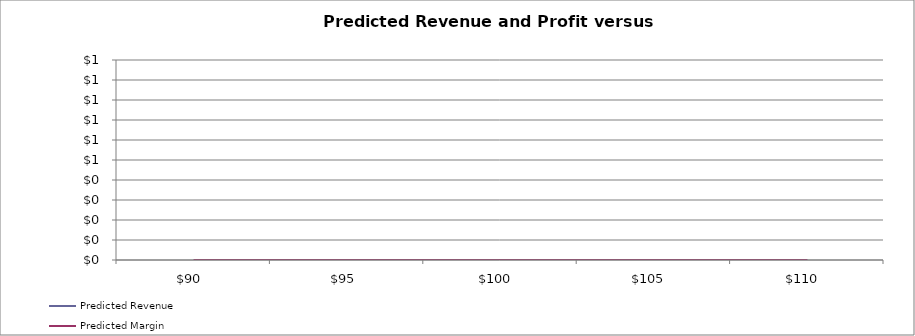
| Category | Predicted Revenue | Predicted Margin |
|---|---|---|
| 90.0 | 0 | 0 |
| 95.0 | 0 | 0 |
| 100.0 | 0 | 0 |
| 105.0 | 0 | 0 |
| 110.0 | 0 | 0 |